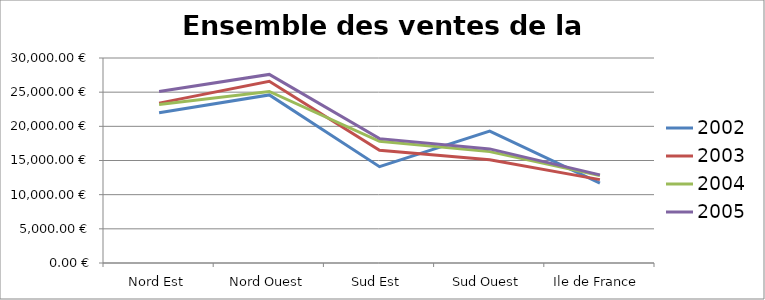
| Category | 2002 | 2003 | 2004 | 2005 |
|---|---|---|---|---|
| Nord Est | 22000 | 23400 | 23200 | 25100 |
| Nord Ouest | 24600 | 26600 | 25100 | 27600 |
| Sud Est | 14100 | 16500 | 17800 | 18200 |
| Sud Ouest | 19300 | 15100 | 16300 | 16700 |
| Ile de France | 11700 | 12200 | 12800 | 12900 |